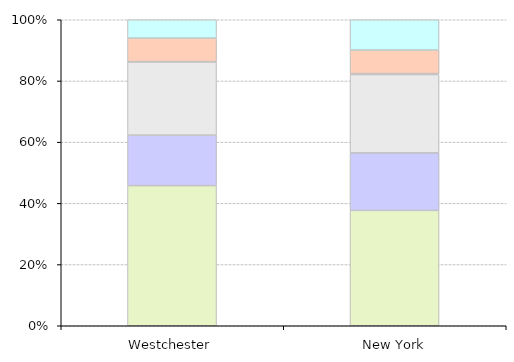
| Category | Management, Professional & related occupations | Service | Sales & Office | Farming, Fishing & Forestry | Construction, Extraction & Maintenance | Production & Transportation |
|---|---|---|---|---|---|---|
| Westchester | 0.458 | 0.165 | 0.239 | 0.001 | 0.077 | 0.06 |
| New York | 0.377 | 0.188 | 0.256 | 0.003 | 0.077 | 0.099 |